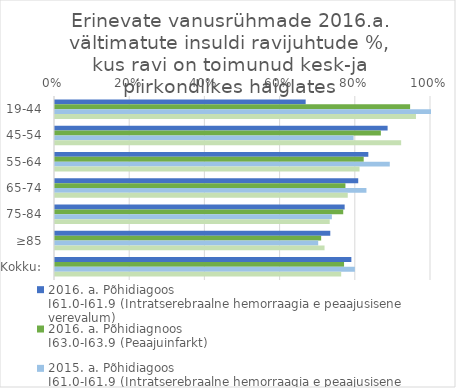
| Category | 2016. a. Põhidiagoos 
I61.0-I61.9 (Intratserebraalne hemorraagia e peaajusisene verevalum) | 2016. a. Põhidiagnoos
I63.0-I63.9 (Peaajuinfarkt) | 2015. a. Põhidiagoos 
I61.0-I61.9 (Intratserebraalne hemorraagia e peaajusisene verevalum) | 2015. a. Põhidiagnoos
I63.0-I63.9 (Peaajuinfarkt) |
|---|---|---|---|---|
| 19-44 | 0.667 | 0.944 | 1 | 0.96 |
| 45-54 | 0.885 | 0.867 | 0.794 | 0.921 |
| 55-64 | 0.833 | 0.821 | 0.89 | 0.81 |
| 65-74 | 0.806 | 0.772 | 0.828 | 0.779 |
| 75-84 | 0.77 | 0.767 | 0.736 | 0.731 |
| ≥85 | 0.732 | 0.708 | 0.7 | 0.717 |
| Kokku: | 0.788 | 0.769 | 0.798 | 0.761 |